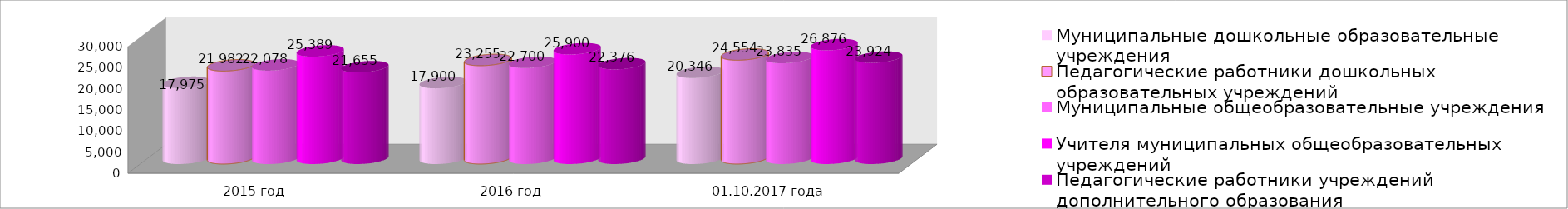
| Category | Муниципальные дошкольные образовательные учреждения | Педагогические работники дошкольных образовательных учреждений | Муниципальные общеобразовательные учреждения | Учителя муниципальных общеобразовательных учреждений | Педагогические работники учреждений дополнительного образования |
|---|---|---|---|---|---|
| 2015 год | 17975 | 21982 | 22078 | 25389 | 21655 |
| 2016 год | 17900 | 23255 | 22700 | 25900 | 22376 |
| 01.10.2017 года | 20346 | 24554 | 23835 | 26876 | 23924 |